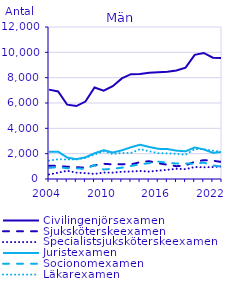
| Category | Civilingenjörsexamen                               | Sjuksköterskeexamen                                | Specialistsjuksköterskeexamen                      | Juristexamen                                       | Socionomexamen                                     | Läkarexamen                                        |
|---|---|---|---|---|---|---|
| 2004.0 | 7055 | 1042 | 357 | 2147 | 875 | 1450 |
| 2005.0 | 6910 | 1035 | 498 | 2159 | 942 | 1561 |
| 2006.0 | 5866 | 966 | 648 | 1691 | 848 | 1540 |
| 2007.0 | 5761 | 928 | 503 | 1563 | 844 | 1544 |
| 2008.0 | 6111 | 901 | 463 | 1714 | 792 | 1661 |
| 2009.0 | 7223 | 1081 | 398 | 2030 | 1107 | 1936 |
| 2010.0 | 6976 | 1201 | 510 | 2275 | 750 | 2183 |
| 2011.0 | 7330 | 1153 | 499 | 2090 | 812 | 1970 |
| 2012.0 | 7942 | 1174 | 571 | 2262 | 891 | 2059 |
| 2013.0 | 8276 | 1150 | 588 | 2507 | 1029 | 2055 |
| 2014.0 | 8282 | 1333 | 638 | 2706 | 1165 | 2361 |
| 2015.0 | 8387 | 1405 | 582 | 2531 | 1248 | 2188 |
| 2016.0 | 8430 | 1244 | 663 | 2381 | 1374 | 2042 |
| 2017.0 | 8465 | 1127 | 724 | 2364 | 1273 | 2030 |
| 2018.0 | 8566 | 1009 | 807 | 2238 | 1224 | 1985 |
| 2019.0 | 8790 | 1076 | 778 | 2188 | 1231 | 1922 |
| 2020.0 | 9800 | 1357 | 946 | 2486 | 1203 | 2363 |
| 2021.0 | 9951 | 1487 | 927 | 2335 | 1295 | 2349 |
| 2022.0 | 9579 | 1444 | 944 | 2064 | 1070 | 2240 |
| 2023.0 | 9550 | 1339 | 994 | 2138 | 975 | 2122 |